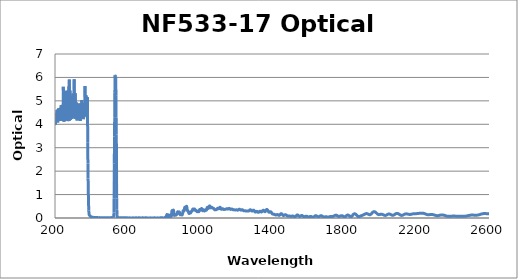
| Category | Optical Density |
|---|---|
| 2600.0 | 0.178 |
| 2599.0 | 0.178 |
| 2598.0 | 0.178 |
| 2597.0 | 0.178 |
| 2596.0 | 0.179 |
| 2595.0 | 0.179 |
| 2594.0 | 0.18 |
| 2593.0 | 0.181 |
| 2592.0 | 0.181 |
| 2591.0 | 0.182 |
| 2590.0 | 0.183 |
| 2589.0 | 0.183 |
| 2588.0 | 0.183 |
| 2587.0 | 0.184 |
| 2586.0 | 0.185 |
| 2585.0 | 0.186 |
| 2584.0 | 0.187 |
| 2583.0 | 0.188 |
| 2582.0 | 0.188 |
| 2581.0 | 0.189 |
| 2580.0 | 0.189 |
| 2579.0 | 0.189 |
| 2578.0 | 0.19 |
| 2577.0 | 0.19 |
| 2576.0 | 0.19 |
| 2575.0 | 0.19 |
| 2574.0 | 0.19 |
| 2573.0 | 0.19 |
| 2572.0 | 0.189 |
| 2571.0 | 0.189 |
| 2570.0 | 0.188 |
| 2569.0 | 0.187 |
| 2568.0 | 0.186 |
| 2567.0 | 0.184 |
| 2566.0 | 0.183 |
| 2565.0 | 0.182 |
| 2564.0 | 0.18 |
| 2563.0 | 0.179 |
| 2562.0 | 0.177 |
| 2561.0 | 0.175 |
| 2560.0 | 0.174 |
| 2559.0 | 0.172 |
| 2558.0 | 0.17 |
| 2557.0 | 0.168 |
| 2556.0 | 0.166 |
| 2555.0 | 0.164 |
| 2554.0 | 0.162 |
| 2553.0 | 0.16 |
| 2552.0 | 0.157 |
| 2551.0 | 0.155 |
| 2550.0 | 0.152 |
| 2549.0 | 0.149 |
| 2548.0 | 0.146 |
| 2547.0 | 0.143 |
| 2546.0 | 0.141 |
| 2545.0 | 0.139 |
| 2544.0 | 0.136 |
| 2543.0 | 0.134 |
| 2542.0 | 0.132 |
| 2541.0 | 0.13 |
| 2540.0 | 0.129 |
| 2539.0 | 0.128 |
| 2538.0 | 0.126 |
| 2537.0 | 0.125 |
| 2536.0 | 0.124 |
| 2535.0 | 0.122 |
| 2534.0 | 0.122 |
| 2533.0 | 0.121 |
| 2532.0 | 0.12 |
| 2531.0 | 0.119 |
| 2530.0 | 0.119 |
| 2529.0 | 0.119 |
| 2528.0 | 0.119 |
| 2527.0 | 0.118 |
| 2526.0 | 0.119 |
| 2525.0 | 0.119 |
| 2524.0 | 0.119 |
| 2523.0 | 0.119 |
| 2522.0 | 0.119 |
| 2521.0 | 0.12 |
| 2520.0 | 0.12 |
| 2519.0 | 0.121 |
| 2518.0 | 0.122 |
| 2517.0 | 0.122 |
| 2516.0 | 0.123 |
| 2515.0 | 0.123 |
| 2514.0 | 0.124 |
| 2513.0 | 0.124 |
| 2512.0 | 0.124 |
| 2511.0 | 0.125 |
| 2510.0 | 0.125 |
| 2509.0 | 0.125 |
| 2508.0 | 0.125 |
| 2507.0 | 0.125 |
| 2506.0 | 0.125 |
| 2505.0 | 0.125 |
| 2504.0 | 0.125 |
| 2503.0 | 0.124 |
| 2502.0 | 0.124 |
| 2501.0 | 0.123 |
| 2500.0 | 0.123 |
| 2499.0 | 0.122 |
| 2498.0 | 0.121 |
| 2497.0 | 0.119 |
| 2496.0 | 0.118 |
| 2495.0 | 0.117 |
| 2494.0 | 0.116 |
| 2493.0 | 0.115 |
| 2492.0 | 0.113 |
| 2491.0 | 0.112 |
| 2490.0 | 0.11 |
| 2489.0 | 0.108 |
| 2488.0 | 0.107 |
| 2487.0 | 0.105 |
| 2486.0 | 0.103 |
| 2485.0 | 0.102 |
| 2484.0 | 0.1 |
| 2483.0 | 0.098 |
| 2482.0 | 0.096 |
| 2481.0 | 0.095 |
| 2480.0 | 0.093 |
| 2479.0 | 0.091 |
| 2478.0 | 0.09 |
| 2477.0 | 0.088 |
| 2476.0 | 0.087 |
| 2475.0 | 0.085 |
| 2474.0 | 0.084 |
| 2473.0 | 0.082 |
| 2472.0 | 0.081 |
| 2471.0 | 0.08 |
| 2470.0 | 0.079 |
| 2469.0 | 0.078 |
| 2468.0 | 0.077 |
| 2467.0 | 0.076 |
| 2466.0 | 0.076 |
| 2465.0 | 0.075 |
| 2464.0 | 0.074 |
| 2463.0 | 0.074 |
| 2462.0 | 0.073 |
| 2461.0 | 0.073 |
| 2460.0 | 0.073 |
| 2459.0 | 0.073 |
| 2458.0 | 0.073 |
| 2457.0 | 0.072 |
| 2456.0 | 0.072 |
| 2455.0 | 0.072 |
| 2454.0 | 0.072 |
| 2453.0 | 0.072 |
| 2452.0 | 0.072 |
| 2451.0 | 0.073 |
| 2450.0 | 0.073 |
| 2449.0 | 0.073 |
| 2448.0 | 0.073 |
| 2447.0 | 0.073 |
| 2446.0 | 0.073 |
| 2445.0 | 0.073 |
| 2444.0 | 0.073 |
| 2443.0 | 0.073 |
| 2442.0 | 0.073 |
| 2441.0 | 0.073 |
| 2440.0 | 0.073 |
| 2439.0 | 0.074 |
| 2438.0 | 0.074 |
| 2437.0 | 0.074 |
| 2436.0 | 0.074 |
| 2435.0 | 0.074 |
| 2434.0 | 0.074 |
| 2433.0 | 0.074 |
| 2432.0 | 0.074 |
| 2431.0 | 0.074 |
| 2430.0 | 0.075 |
| 2429.0 | 0.075 |
| 2428.0 | 0.075 |
| 2427.0 | 0.075 |
| 2426.0 | 0.075 |
| 2425.0 | 0.076 |
| 2424.0 | 0.076 |
| 2423.0 | 0.076 |
| 2422.0 | 0.077 |
| 2421.0 | 0.077 |
| 2420.0 | 0.078 |
| 2419.0 | 0.078 |
| 2418.0 | 0.078 |
| 2417.0 | 0.079 |
| 2416.0 | 0.079 |
| 2415.0 | 0.079 |
| 2414.0 | 0.08 |
| 2413.0 | 0.08 |
| 2412.0 | 0.081 |
| 2411.0 | 0.081 |
| 2410.0 | 0.082 |
| 2409.0 | 0.082 |
| 2408.0 | 0.082 |
| 2407.0 | 0.082 |
| 2406.0 | 0.082 |
| 2405.0 | 0.082 |
| 2404.0 | 0.082 |
| 2403.0 | 0.082 |
| 2402.0 | 0.082 |
| 2401.0 | 0.082 |
| 2400.0 | 0.082 |
| 2399.0 | 0.082 |
| 2398.0 | 0.081 |
| 2397.0 | 0.081 |
| 2396.0 | 0.08 |
| 2395.0 | 0.08 |
| 2394.0 | 0.079 |
| 2393.0 | 0.078 |
| 2392.0 | 0.078 |
| 2391.0 | 0.077 |
| 2390.0 | 0.076 |
| 2389.0 | 0.076 |
| 2388.0 | 0.075 |
| 2387.0 | 0.074 |
| 2386.0 | 0.073 |
| 2385.0 | 0.072 |
| 2384.0 | 0.072 |
| 2383.0 | 0.071 |
| 2382.0 | 0.071 |
| 2381.0 | 0.071 |
| 2380.0 | 0.07 |
| 2379.0 | 0.07 |
| 2378.0 | 0.07 |
| 2377.0 | 0.07 |
| 2376.0 | 0.07 |
| 2375.0 | 0.071 |
| 2374.0 | 0.071 |
| 2373.0 | 0.072 |
| 2372.0 | 0.073 |
| 2371.0 | 0.074 |
| 2370.0 | 0.075 |
| 2369.0 | 0.077 |
| 2368.0 | 0.078 |
| 2367.0 | 0.08 |
| 2366.0 | 0.082 |
| 2365.0 | 0.084 |
| 2364.0 | 0.086 |
| 2363.0 | 0.088 |
| 2362.0 | 0.09 |
| 2361.0 | 0.093 |
| 2360.0 | 0.095 |
| 2359.0 | 0.098 |
| 2358.0 | 0.1 |
| 2357.0 | 0.103 |
| 2356.0 | 0.106 |
| 2355.0 | 0.108 |
| 2354.0 | 0.111 |
| 2353.0 | 0.113 |
| 2352.0 | 0.115 |
| 2351.0 | 0.118 |
| 2350.0 | 0.12 |
| 2349.0 | 0.122 |
| 2348.0 | 0.124 |
| 2347.0 | 0.125 |
| 2346.0 | 0.126 |
| 2345.0 | 0.128 |
| 2344.0 | 0.129 |
| 2343.0 | 0.129 |
| 2342.0 | 0.13 |
| 2341.0 | 0.13 |
| 2340.0 | 0.13 |
| 2339.0 | 0.13 |
| 2338.0 | 0.13 |
| 2337.0 | 0.129 |
| 2336.0 | 0.129 |
| 2335.0 | 0.128 |
| 2334.0 | 0.127 |
| 2333.0 | 0.126 |
| 2332.0 | 0.124 |
| 2331.0 | 0.122 |
| 2330.0 | 0.121 |
| 2329.0 | 0.119 |
| 2328.0 | 0.118 |
| 2327.0 | 0.116 |
| 2326.0 | 0.114 |
| 2325.0 | 0.112 |
| 2324.0 | 0.11 |
| 2323.0 | 0.108 |
| 2322.0 | 0.107 |
| 2321.0 | 0.105 |
| 2320.0 | 0.104 |
| 2319.0 | 0.103 |
| 2318.0 | 0.101 |
| 2317.0 | 0.101 |
| 2316.0 | 0.1 |
| 2315.0 | 0.099 |
| 2314.0 | 0.099 |
| 2313.0 | 0.099 |
| 2312.0 | 0.1 |
| 2311.0 | 0.1 |
| 2310.0 | 0.101 |
| 2309.0 | 0.102 |
| 2308.0 | 0.103 |
| 2307.0 | 0.105 |
| 2306.0 | 0.107 |
| 2305.0 | 0.109 |
| 2304.0 | 0.111 |
| 2303.0 | 0.113 |
| 2302.0 | 0.116 |
| 2301.0 | 0.118 |
| 2300.0 | 0.121 |
| 2299.0 | 0.124 |
| 2298.0 | 0.126 |
| 2297.0 | 0.129 |
| 2296.0 | 0.131 |
| 2295.0 | 0.134 |
| 2294.0 | 0.136 |
| 2293.0 | 0.138 |
| 2292.0 | 0.14 |
| 2291.0 | 0.142 |
| 2290.0 | 0.144 |
| 2289.0 | 0.146 |
| 2288.0 | 0.147 |
| 2287.0 | 0.148 |
| 2286.0 | 0.149 |
| 2285.0 | 0.15 |
| 2284.0 | 0.151 |
| 2283.0 | 0.151 |
| 2282.0 | 0.151 |
| 2281.0 | 0.151 |
| 2280.0 | 0.151 |
| 2279.0 | 0.15 |
| 2278.0 | 0.15 |
| 2277.0 | 0.149 |
| 2276.0 | 0.148 |
| 2275.0 | 0.147 |
| 2274.0 | 0.146 |
| 2273.0 | 0.145 |
| 2272.0 | 0.144 |
| 2271.0 | 0.143 |
| 2270.0 | 0.142 |
| 2269.0 | 0.141 |
| 2268.0 | 0.141 |
| 2267.0 | 0.14 |
| 2266.0 | 0.14 |
| 2265.0 | 0.14 |
| 2264.0 | 0.14 |
| 2263.0 | 0.14 |
| 2262.0 | 0.141 |
| 2261.0 | 0.142 |
| 2260.0 | 0.143 |
| 2259.0 | 0.144 |
| 2258.0 | 0.146 |
| 2257.0 | 0.148 |
| 2256.0 | 0.15 |
| 2255.0 | 0.152 |
| 2254.0 | 0.155 |
| 2253.0 | 0.158 |
| 2252.0 | 0.161 |
| 2251.0 | 0.164 |
| 2250.0 | 0.167 |
| 2249.0 | 0.17 |
| 2248.0 | 0.173 |
| 2247.0 | 0.176 |
| 2246.0 | 0.18 |
| 2245.0 | 0.183 |
| 2244.0 | 0.186 |
| 2243.0 | 0.189 |
| 2242.0 | 0.192 |
| 2241.0 | 0.194 |
| 2240.0 | 0.196 |
| 2239.0 | 0.198 |
| 2238.0 | 0.2 |
| 2237.0 | 0.202 |
| 2236.0 | 0.204 |
| 2235.0 | 0.205 |
| 2234.0 | 0.206 |
| 2233.0 | 0.207 |
| 2232.0 | 0.207 |
| 2231.0 | 0.207 |
| 2230.0 | 0.207 |
| 2229.0 | 0.208 |
| 2228.0 | 0.207 |
| 2227.0 | 0.207 |
| 2226.0 | 0.206 |
| 2225.0 | 0.206 |
| 2224.0 | 0.205 |
| 2223.0 | 0.205 |
| 2222.0 | 0.204 |
| 2221.0 | 0.203 |
| 2220.0 | 0.203 |
| 2219.0 | 0.202 |
| 2218.0 | 0.201 |
| 2217.0 | 0.201 |
| 2216.0 | 0.2 |
| 2215.0 | 0.199 |
| 2214.0 | 0.199 |
| 2213.0 | 0.198 |
| 2212.0 | 0.198 |
| 2211.0 | 0.197 |
| 2210.0 | 0.197 |
| 2209.0 | 0.196 |
| 2208.0 | 0.195 |
| 2207.0 | 0.194 |
| 2206.0 | 0.194 |
| 2205.0 | 0.192 |
| 2204.0 | 0.191 |
| 2203.0 | 0.19 |
| 2202.0 | 0.189 |
| 2201.0 | 0.188 |
| 2200.0 | 0.187 |
| 2199.0 | 0.186 |
| 2198.0 | 0.185 |
| 2197.0 | 0.184 |
| 2196.0 | 0.184 |
| 2195.0 | 0.184 |
| 2194.0 | 0.184 |
| 2193.0 | 0.183 |
| 2192.0 | 0.183 |
| 2191.0 | 0.183 |
| 2190.0 | 0.183 |
| 2189.0 | 0.183 |
| 2188.0 | 0.184 |
| 2187.0 | 0.183 |
| 2186.0 | 0.183 |
| 2185.0 | 0.182 |
| 2184.0 | 0.182 |
| 2183.0 | 0.181 |
| 2182.0 | 0.18 |
| 2181.0 | 0.179 |
| 2180.0 | 0.178 |
| 2179.0 | 0.177 |
| 2178.0 | 0.175 |
| 2177.0 | 0.173 |
| 2176.0 | 0.171 |
| 2175.0 | 0.17 |
| 2174.0 | 0.168 |
| 2173.0 | 0.165 |
| 2172.0 | 0.163 |
| 2171.0 | 0.162 |
| 2170.0 | 0.16 |
| 2169.0 | 0.158 |
| 2168.0 | 0.157 |
| 2167.0 | 0.155 |
| 2166.0 | 0.154 |
| 2165.0 | 0.153 |
| 2164.0 | 0.153 |
| 2163.0 | 0.152 |
| 2162.0 | 0.152 |
| 2161.0 | 0.152 |
| 2160.0 | 0.153 |
| 2159.0 | 0.153 |
| 2158.0 | 0.154 |
| 2157.0 | 0.156 |
| 2156.0 | 0.157 |
| 2155.0 | 0.159 |
| 2154.0 | 0.161 |
| 2153.0 | 0.163 |
| 2152.0 | 0.164 |
| 2151.0 | 0.166 |
| 2150.0 | 0.168 |
| 2149.0 | 0.17 |
| 2148.0 | 0.172 |
| 2147.0 | 0.173 |
| 2146.0 | 0.175 |
| 2145.0 | 0.176 |
| 2144.0 | 0.176 |
| 2143.0 | 0.177 |
| 2142.0 | 0.177 |
| 2141.0 | 0.177 |
| 2140.0 | 0.176 |
| 2139.0 | 0.175 |
| 2138.0 | 0.173 |
| 2137.0 | 0.171 |
| 2136.0 | 0.169 |
| 2135.0 | 0.167 |
| 2134.0 | 0.164 |
| 2133.0 | 0.161 |
| 2132.0 | 0.157 |
| 2131.0 | 0.153 |
| 2130.0 | 0.15 |
| 2129.0 | 0.146 |
| 2128.0 | 0.142 |
| 2127.0 | 0.138 |
| 2126.0 | 0.134 |
| 2125.0 | 0.13 |
| 2124.0 | 0.126 |
| 2123.0 | 0.122 |
| 2122.0 | 0.119 |
| 2121.0 | 0.116 |
| 2120.0 | 0.114 |
| 2119.0 | 0.112 |
| 2118.0 | 0.111 |
| 2117.0 | 0.111 |
| 2116.0 | 0.111 |
| 2115.0 | 0.112 |
| 2114.0 | 0.113 |
| 2113.0 | 0.115 |
| 2112.0 | 0.118 |
| 2111.0 | 0.122 |
| 2110.0 | 0.125 |
| 2109.0 | 0.13 |
| 2108.0 | 0.135 |
| 2107.0 | 0.14 |
| 2106.0 | 0.145 |
| 2105.0 | 0.15 |
| 2104.0 | 0.155 |
| 2103.0 | 0.161 |
| 2102.0 | 0.166 |
| 2101.0 | 0.171 |
| 2100.0 | 0.175 |
| 2099.0 | 0.179 |
| 2098.0 | 0.183 |
| 2097.0 | 0.187 |
| 2096.0 | 0.189 |
| 2095.0 | 0.192 |
| 2094.0 | 0.193 |
| 2093.0 | 0.195 |
| 2092.0 | 0.195 |
| 2091.0 | 0.195 |
| 2090.0 | 0.194 |
| 2089.0 | 0.193 |
| 2088.0 | 0.191 |
| 2087.0 | 0.189 |
| 2086.0 | 0.186 |
| 2085.0 | 0.182 |
| 2084.0 | 0.178 |
| 2083.0 | 0.174 |
| 2082.0 | 0.169 |
| 2081.0 | 0.164 |
| 2080.0 | 0.159 |
| 2079.0 | 0.154 |
| 2078.0 | 0.149 |
| 2077.0 | 0.144 |
| 2076.0 | 0.139 |
| 2075.0 | 0.134 |
| 2074.0 | 0.13 |
| 2073.0 | 0.126 |
| 2072.0 | 0.123 |
| 2071.0 | 0.121 |
| 2070.0 | 0.119 |
| 2069.0 | 0.117 |
| 2068.0 | 0.117 |
| 2067.0 | 0.117 |
| 2066.0 | 0.118 |
| 2065.0 | 0.12 |
| 2064.0 | 0.122 |
| 2063.0 | 0.125 |
| 2062.0 | 0.128 |
| 2061.0 | 0.132 |
| 2060.0 | 0.135 |
| 2059.0 | 0.139 |
| 2058.0 | 0.143 |
| 2057.0 | 0.147 |
| 2056.0 | 0.151 |
| 2055.0 | 0.155 |
| 2054.0 | 0.158 |
| 2053.0 | 0.161 |
| 2052.0 | 0.164 |
| 2051.0 | 0.167 |
| 2050.0 | 0.168 |
| 2049.0 | 0.169 |
| 2048.0 | 0.17 |
| 2047.0 | 0.171 |
| 2046.0 | 0.17 |
| 2045.0 | 0.169 |
| 2044.0 | 0.168 |
| 2043.0 | 0.165 |
| 2042.0 | 0.163 |
| 2041.0 | 0.16 |
| 2040.0 | 0.156 |
| 2039.0 | 0.152 |
| 2038.0 | 0.148 |
| 2037.0 | 0.144 |
| 2036.0 | 0.139 |
| 2035.0 | 0.135 |
| 2034.0 | 0.131 |
| 2033.0 | 0.127 |
| 2032.0 | 0.123 |
| 2031.0 | 0.119 |
| 2030.0 | 0.116 |
| 2029.0 | 0.114 |
| 2028.0 | 0.112 |
| 2027.0 | 0.111 |
| 2026.0 | 0.11 |
| 2025.0 | 0.11 |
| 2024.0 | 0.111 |
| 2023.0 | 0.113 |
| 2022.0 | 0.115 |
| 2021.0 | 0.117 |
| 2020.0 | 0.121 |
| 2019.0 | 0.124 |
| 2018.0 | 0.128 |
| 2017.0 | 0.132 |
| 2016.0 | 0.135 |
| 2015.0 | 0.139 |
| 2014.0 | 0.143 |
| 2013.0 | 0.147 |
| 2012.0 | 0.15 |
| 2011.0 | 0.153 |
| 2010.0 | 0.156 |
| 2009.0 | 0.158 |
| 2008.0 | 0.16 |
| 2007.0 | 0.161 |
| 2006.0 | 0.162 |
| 2005.0 | 0.163 |
| 2004.0 | 0.162 |
| 2003.0 | 0.162 |
| 2002.0 | 0.161 |
| 2001.0 | 0.16 |
| 2000.0 | 0.158 |
| 1999.0 | 0.156 |
| 1998.0 | 0.154 |
| 1997.0 | 0.152 |
| 1996.0 | 0.15 |
| 1995.0 | 0.147 |
| 1994.0 | 0.146 |
| 1993.0 | 0.145 |
| 1992.0 | 0.144 |
| 1991.0 | 0.144 |
| 1990.0 | 0.144 |
| 1989.0 | 0.146 |
| 1988.0 | 0.148 |
| 1987.0 | 0.151 |
| 1986.0 | 0.155 |
| 1985.0 | 0.159 |
| 1984.0 | 0.165 |
| 1983.0 | 0.171 |
| 1982.0 | 0.177 |
| 1981.0 | 0.184 |
| 1980.0 | 0.192 |
| 1979.0 | 0.199 |
| 1978.0 | 0.207 |
| 1977.0 | 0.215 |
| 1976.0 | 0.222 |
| 1975.0 | 0.229 |
| 1974.0 | 0.236 |
| 1973.0 | 0.243 |
| 1972.0 | 0.249 |
| 1971.0 | 0.255 |
| 1970.0 | 0.259 |
| 1969.0 | 0.264 |
| 1968.0 | 0.267 |
| 1967.0 | 0.269 |
| 1966.0 | 0.27 |
| 1965.0 | 0.271 |
| 1964.0 | 0.271 |
| 1963.0 | 0.269 |
| 1962.0 | 0.267 |
| 1961.0 | 0.264 |
| 1960.0 | 0.259 |
| 1959.0 | 0.254 |
| 1958.0 | 0.248 |
| 1957.0 | 0.241 |
| 1956.0 | 0.234 |
| 1955.0 | 0.226 |
| 1954.0 | 0.218 |
| 1953.0 | 0.21 |
| 1952.0 | 0.201 |
| 1951.0 | 0.193 |
| 1950.0 | 0.184 |
| 1949.0 | 0.177 |
| 1948.0 | 0.169 |
| 1947.0 | 0.162 |
| 1946.0 | 0.156 |
| 1945.0 | 0.151 |
| 1944.0 | 0.147 |
| 1943.0 | 0.144 |
| 1942.0 | 0.142 |
| 1941.0 | 0.141 |
| 1940.0 | 0.141 |
| 1939.0 | 0.142 |
| 1938.0 | 0.144 |
| 1937.0 | 0.146 |
| 1936.0 | 0.149 |
| 1935.0 | 0.152 |
| 1934.0 | 0.156 |
| 1933.0 | 0.159 |
| 1932.0 | 0.163 |
| 1931.0 | 0.167 |
| 1930.0 | 0.171 |
| 1929.0 | 0.175 |
| 1928.0 | 0.178 |
| 1927.0 | 0.181 |
| 1926.0 | 0.184 |
| 1925.0 | 0.186 |
| 1924.0 | 0.187 |
| 1923.0 | 0.187 |
| 1922.0 | 0.187 |
| 1921.0 | 0.187 |
| 1920.0 | 0.186 |
| 1919.0 | 0.184 |
| 1918.0 | 0.182 |
| 1917.0 | 0.179 |
| 1916.0 | 0.176 |
| 1915.0 | 0.172 |
| 1914.0 | 0.168 |
| 1913.0 | 0.164 |
| 1912.0 | 0.16 |
| 1911.0 | 0.155 |
| 1910.0 | 0.151 |
| 1909.0 | 0.147 |
| 1908.0 | 0.143 |
| 1907.0 | 0.139 |
| 1906.0 | 0.135 |
| 1905.0 | 0.131 |
| 1904.0 | 0.128 |
| 1903.0 | 0.125 |
| 1902.0 | 0.122 |
| 1901.0 | 0.119 |
| 1900.0 | 0.116 |
| 1899.0 | 0.113 |
| 1898.0 | 0.111 |
| 1897.0 | 0.108 |
| 1896.0 | 0.105 |
| 1895.0 | 0.103 |
| 1894.0 | 0.099 |
| 1893.0 | 0.096 |
| 1892.0 | 0.093 |
| 1891.0 | 0.09 |
| 1890.0 | 0.087 |
| 1889.0 | 0.083 |
| 1888.0 | 0.08 |
| 1887.0 | 0.076 |
| 1886.0 | 0.073 |
| 1885.0 | 0.07 |
| 1884.0 | 0.067 |
| 1883.0 | 0.064 |
| 1882.0 | 0.062 |
| 1881.0 | 0.06 |
| 1880.0 | 0.059 |
| 1879.0 | 0.059 |
| 1878.0 | 0.06 |
| 1877.0 | 0.062 |
| 1876.0 | 0.065 |
| 1875.0 | 0.069 |
| 1874.0 | 0.075 |
| 1873.0 | 0.081 |
| 1872.0 | 0.089 |
| 1871.0 | 0.096 |
| 1870.0 | 0.104 |
| 1869.0 | 0.113 |
| 1868.0 | 0.122 |
| 1867.0 | 0.13 |
| 1866.0 | 0.138 |
| 1865.0 | 0.145 |
| 1864.0 | 0.151 |
| 1863.0 | 0.157 |
| 1862.0 | 0.163 |
| 1861.0 | 0.169 |
| 1860.0 | 0.173 |
| 1859.0 | 0.177 |
| 1858.0 | 0.179 |
| 1857.0 | 0.179 |
| 1856.0 | 0.179 |
| 1855.0 | 0.177 |
| 1854.0 | 0.174 |
| 1853.0 | 0.17 |
| 1852.0 | 0.165 |
| 1851.0 | 0.16 |
| 1850.0 | 0.154 |
| 1849.0 | 0.145 |
| 1848.0 | 0.135 |
| 1847.0 | 0.125 |
| 1846.0 | 0.115 |
| 1845.0 | 0.108 |
| 1844.0 | 0.099 |
| 1843.0 | 0.09 |
| 1842.0 | 0.081 |
| 1841.0 | 0.073 |
| 1840.0 | 0.066 |
| 1839.0 | 0.061 |
| 1838.0 | 0.057 |
| 1837.0 | 0.054 |
| 1836.0 | 0.054 |
| 1835.0 | 0.054 |
| 1834.0 | 0.056 |
| 1833.0 | 0.059 |
| 1832.0 | 0.063 |
| 1831.0 | 0.069 |
| 1830.0 | 0.075 |
| 1829.0 | 0.083 |
| 1828.0 | 0.089 |
| 1827.0 | 0.096 |
| 1826.0 | 0.103 |
| 1825.0 | 0.109 |
| 1824.0 | 0.114 |
| 1823.0 | 0.117 |
| 1822.0 | 0.121 |
| 1821.0 | 0.124 |
| 1820.0 | 0.126 |
| 1819.0 | 0.127 |
| 1818.0 | 0.126 |
| 1817.0 | 0.124 |
| 1816.0 | 0.121 |
| 1815.0 | 0.117 |
| 1814.0 | 0.112 |
| 1813.0 | 0.107 |
| 1812.0 | 0.101 |
| 1811.0 | 0.094 |
| 1810.0 | 0.087 |
| 1809.0 | 0.081 |
| 1808.0 | 0.074 |
| 1807.0 | 0.069 |
| 1806.0 | 0.063 |
| 1805.0 | 0.058 |
| 1804.0 | 0.054 |
| 1803.0 | 0.051 |
| 1802.0 | 0.049 |
| 1801.0 | 0.048 |
| 1800.0 | 0.049 |
| 1799.0 | 0.051 |
| 1798.0 | 0.054 |
| 1797.0 | 0.057 |
| 1796.0 | 0.061 |
| 1795.0 | 0.066 |
| 1794.0 | 0.071 |
| 1793.0 | 0.077 |
| 1792.0 | 0.082 |
| 1791.0 | 0.087 |
| 1790.0 | 0.091 |
| 1789.0 | 0.094 |
| 1788.0 | 0.097 |
| 1787.0 | 0.099 |
| 1786.0 | 0.101 |
| 1785.0 | 0.101 |
| 1784.0 | 0.101 |
| 1783.0 | 0.099 |
| 1782.0 | 0.097 |
| 1781.0 | 0.095 |
| 1780.0 | 0.091 |
| 1779.0 | 0.088 |
| 1778.0 | 0.084 |
| 1777.0 | 0.08 |
| 1776.0 | 0.077 |
| 1775.0 | 0.073 |
| 1774.0 | 0.071 |
| 1773.0 | 0.068 |
| 1772.0 | 0.067 |
| 1771.0 | 0.066 |
| 1770.0 | 0.066 |
| 1769.0 | 0.067 |
| 1768.0 | 0.069 |
| 1767.0 | 0.071 |
| 1766.0 | 0.075 |
| 1765.0 | 0.079 |
| 1764.0 | 0.083 |
| 1763.0 | 0.088 |
| 1762.0 | 0.093 |
| 1761.0 | 0.098 |
| 1760.0 | 0.103 |
| 1759.0 | 0.108 |
| 1758.0 | 0.112 |
| 1757.0 | 0.115 |
| 1756.0 | 0.118 |
| 1755.0 | 0.12 |
| 1754.0 | 0.121 |
| 1753.0 | 0.121 |
| 1752.0 | 0.121 |
| 1751.0 | 0.119 |
| 1750.0 | 0.117 |
| 1749.0 | 0.114 |
| 1748.0 | 0.111 |
| 1747.0 | 0.107 |
| 1746.0 | 0.103 |
| 1745.0 | 0.098 |
| 1744.0 | 0.094 |
| 1743.0 | 0.089 |
| 1742.0 | 0.085 |
| 1741.0 | 0.081 |
| 1740.0 | 0.078 |
| 1739.0 | 0.075 |
| 1738.0 | 0.072 |
| 1737.0 | 0.07 |
| 1736.0 | 0.069 |
| 1735.0 | 0.068 |
| 1734.0 | 0.068 |
| 1733.0 | 0.067 |
| 1732.0 | 0.067 |
| 1731.0 | 0.068 |
| 1730.0 | 0.068 |
| 1729.0 | 0.068 |
| 1728.0 | 0.068 |
| 1727.0 | 0.068 |
| 1726.0 | 0.067 |
| 1725.0 | 0.067 |
| 1724.0 | 0.066 |
| 1723.0 | 0.064 |
| 1722.0 | 0.063 |
| 1721.0 | 0.061 |
| 1720.0 | 0.058 |
| 1719.0 | 0.056 |
| 1718.0 | 0.053 |
| 1717.0 | 0.051 |
| 1716.0 | 0.048 |
| 1715.0 | 0.046 |
| 1714.0 | 0.044 |
| 1713.0 | 0.042 |
| 1712.0 | 0.041 |
| 1711.0 | 0.041 |
| 1710.0 | 0.04 |
| 1709.0 | 0.04 |
| 1708.0 | 0.041 |
| 1707.0 | 0.042 |
| 1706.0 | 0.043 |
| 1705.0 | 0.045 |
| 1704.0 | 0.046 |
| 1703.0 | 0.048 |
| 1702.0 | 0.049 |
| 1701.0 | 0.05 |
| 1700.0 | 0.051 |
| 1699.0 | 0.051 |
| 1698.0 | 0.051 |
| 1697.0 | 0.051 |
| 1696.0 | 0.051 |
| 1695.0 | 0.05 |
| 1694.0 | 0.049 |
| 1693.0 | 0.048 |
| 1692.0 | 0.047 |
| 1691.0 | 0.046 |
| 1690.0 | 0.045 |
| 1689.0 | 0.045 |
| 1688.0 | 0.045 |
| 1687.0 | 0.045 |
| 1686.0 | 0.046 |
| 1685.0 | 0.048 |
| 1684.0 | 0.051 |
| 1683.0 | 0.054 |
| 1682.0 | 0.058 |
| 1681.0 | 0.063 |
| 1680.0 | 0.068 |
| 1679.0 | 0.073 |
| 1678.0 | 0.078 |
| 1677.0 | 0.083 |
| 1676.0 | 0.087 |
| 1675.0 | 0.092 |
| 1674.0 | 0.095 |
| 1673.0 | 0.098 |
| 1672.0 | 0.099 |
| 1671.0 | 0.1 |
| 1670.0 | 0.099 |
| 1669.0 | 0.098 |
| 1668.0 | 0.095 |
| 1667.0 | 0.092 |
| 1666.0 | 0.087 |
| 1665.0 | 0.083 |
| 1664.0 | 0.077 |
| 1663.0 | 0.072 |
| 1662.0 | 0.067 |
| 1661.0 | 0.062 |
| 1660.0 | 0.057 |
| 1659.0 | 0.054 |
| 1658.0 | 0.051 |
| 1657.0 | 0.05 |
| 1656.0 | 0.049 |
| 1655.0 | 0.05 |
| 1654.0 | 0.052 |
| 1653.0 | 0.055 |
| 1652.0 | 0.059 |
| 1651.0 | 0.064 |
| 1650.0 | 0.069 |
| 1649.0 | 0.075 |
| 1648.0 | 0.08 |
| 1647.0 | 0.085 |
| 1646.0 | 0.09 |
| 1645.0 | 0.094 |
| 1644.0 | 0.096 |
| 1643.0 | 0.098 |
| 1642.0 | 0.099 |
| 1641.0 | 0.098 |
| 1640.0 | 0.096 |
| 1639.0 | 0.093 |
| 1638.0 | 0.088 |
| 1637.0 | 0.083 |
| 1636.0 | 0.077 |
| 1635.0 | 0.07 |
| 1634.0 | 0.062 |
| 1633.0 | 0.055 |
| 1632.0 | 0.048 |
| 1631.0 | 0.042 |
| 1630.0 | 0.037 |
| 1629.0 | 0.033 |
| 1628.0 | 0.031 |
| 1627.0 | 0.029 |
| 1626.0 | 0.03 |
| 1625.0 | 0.031 |
| 1624.0 | 0.034 |
| 1623.0 | 0.037 |
| 1622.0 | 0.042 |
| 1621.0 | 0.046 |
| 1620.0 | 0.051 |
| 1619.0 | 0.055 |
| 1618.0 | 0.059 |
| 1617.0 | 0.063 |
| 1616.0 | 0.065 |
| 1615.0 | 0.067 |
| 1614.0 | 0.068 |
| 1613.0 | 0.068 |
| 1612.0 | 0.067 |
| 1611.0 | 0.065 |
| 1610.0 | 0.062 |
| 1609.0 | 0.059 |
| 1608.0 | 0.056 |
| 1607.0 | 0.053 |
| 1606.0 | 0.05 |
| 1605.0 | 0.047 |
| 1604.0 | 0.045 |
| 1603.0 | 0.044 |
| 1602.0 | 0.044 |
| 1601.0 | 0.044 |
| 1600.0 | 0.046 |
| 1599.0 | 0.049 |
| 1598.0 | 0.052 |
| 1597.0 | 0.056 |
| 1596.0 | 0.06 |
| 1595.0 | 0.064 |
| 1594.0 | 0.068 |
| 1593.0 | 0.072 |
| 1592.0 | 0.075 |
| 1591.0 | 0.077 |
| 1590.0 | 0.078 |
| 1589.0 | 0.078 |
| 1588.0 | 0.077 |
| 1587.0 | 0.075 |
| 1586.0 | 0.072 |
| 1585.0 | 0.069 |
| 1584.0 | 0.066 |
| 1583.0 | 0.062 |
| 1582.0 | 0.059 |
| 1581.0 | 0.056 |
| 1580.0 | 0.055 |
| 1579.0 | 0.054 |
| 1578.0 | 0.054 |
| 1577.0 | 0.056 |
| 1576.0 | 0.058 |
| 1575.0 | 0.062 |
| 1574.0 | 0.067 |
| 1573.0 | 0.072 |
| 1572.0 | 0.078 |
| 1571.0 | 0.083 |
| 1570.0 | 0.089 |
| 1569.0 | 0.094 |
| 1568.0 | 0.098 |
| 1567.0 | 0.102 |
| 1566.0 | 0.104 |
| 1565.0 | 0.105 |
| 1564.0 | 0.105 |
| 1563.0 | 0.103 |
| 1562.0 | 0.101 |
| 1561.0 | 0.097 |
| 1560.0 | 0.092 |
| 1559.0 | 0.087 |
| 1558.0 | 0.082 |
| 1557.0 | 0.077 |
| 1556.0 | 0.073 |
| 1555.0 | 0.07 |
| 1554.0 | 0.068 |
| 1553.0 | 0.068 |
| 1552.0 | 0.069 |
| 1551.0 | 0.073 |
| 1550.0 | 0.077 |
| 1549.0 | 0.083 |
| 1548.0 | 0.09 |
| 1547.0 | 0.097 |
| 1546.0 | 0.105 |
| 1545.0 | 0.112 |
| 1544.0 | 0.118 |
| 1543.0 | 0.123 |
| 1542.0 | 0.127 |
| 1541.0 | 0.129 |
| 1540.0 | 0.129 |
| 1539.0 | 0.128 |
| 1538.0 | 0.125 |
| 1537.0 | 0.121 |
| 1536.0 | 0.115 |
| 1535.0 | 0.108 |
| 1534.0 | 0.1 |
| 1533.0 | 0.092 |
| 1532.0 | 0.083 |
| 1531.0 | 0.075 |
| 1530.0 | 0.068 |
| 1529.0 | 0.062 |
| 1528.0 | 0.057 |
| 1527.0 | 0.054 |
| 1526.0 | 0.053 |
| 1525.0 | 0.053 |
| 1524.0 | 0.055 |
| 1523.0 | 0.058 |
| 1522.0 | 0.062 |
| 1521.0 | 0.066 |
| 1520.0 | 0.071 |
| 1519.0 | 0.076 |
| 1518.0 | 0.079 |
| 1517.0 | 0.082 |
| 1516.0 | 0.085 |
| 1515.0 | 0.086 |
| 1514.0 | 0.085 |
| 1513.0 | 0.084 |
| 1512.0 | 0.082 |
| 1511.0 | 0.08 |
| 1510.0 | 0.077 |
| 1509.0 | 0.074 |
| 1508.0 | 0.072 |
| 1507.0 | 0.069 |
| 1506.0 | 0.068 |
| 1505.0 | 0.068 |
| 1504.0 | 0.069 |
| 1503.0 | 0.07 |
| 1502.0 | 0.072 |
| 1501.0 | 0.075 |
| 1500.0 | 0.078 |
| 1499.0 | 0.081 |
| 1498.0 | 0.084 |
| 1497.0 | 0.086 |
| 1496.0 | 0.088 |
| 1495.0 | 0.09 |
| 1494.0 | 0.09 |
| 1493.0 | 0.091 |
| 1492.0 | 0.09 |
| 1491.0 | 0.09 |
| 1490.0 | 0.089 |
| 1489.0 | 0.088 |
| 1488.0 | 0.088 |
| 1487.0 | 0.088 |
| 1486.0 | 0.089 |
| 1485.0 | 0.092 |
| 1484.0 | 0.095 |
| 1483.0 | 0.099 |
| 1482.0 | 0.104 |
| 1481.0 | 0.11 |
| 1480.0 | 0.116 |
| 1479.0 | 0.123 |
| 1478.0 | 0.128 |
| 1477.0 | 0.134 |
| 1476.0 | 0.138 |
| 1475.0 | 0.14 |
| 1474.0 | 0.141 |
| 1473.0 | 0.14 |
| 1472.0 | 0.138 |
| 1471.0 | 0.135 |
| 1470.0 | 0.13 |
| 1469.0 | 0.125 |
| 1468.0 | 0.119 |
| 1467.0 | 0.114 |
| 1466.0 | 0.11 |
| 1465.0 | 0.107 |
| 1464.0 | 0.107 |
| 1463.0 | 0.108 |
| 1462.0 | 0.111 |
| 1461.0 | 0.116 |
| 1460.0 | 0.124 |
| 1459.0 | 0.132 |
| 1458.0 | 0.142 |
| 1457.0 | 0.151 |
| 1456.0 | 0.16 |
| 1455.0 | 0.168 |
| 1454.0 | 0.175 |
| 1453.0 | 0.18 |
| 1452.0 | 0.183 |
| 1451.0 | 0.184 |
| 1450.0 | 0.183 |
| 1449.0 | 0.179 |
| 1448.0 | 0.174 |
| 1447.0 | 0.166 |
| 1446.0 | 0.157 |
| 1445.0 | 0.148 |
| 1444.0 | 0.139 |
| 1443.0 | 0.131 |
| 1442.0 | 0.123 |
| 1441.0 | 0.117 |
| 1440.0 | 0.113 |
| 1439.0 | 0.112 |
| 1438.0 | 0.112 |
| 1437.0 | 0.115 |
| 1436.0 | 0.12 |
| 1435.0 | 0.125 |
| 1434.0 | 0.13 |
| 1433.0 | 0.136 |
| 1432.0 | 0.14 |
| 1431.0 | 0.144 |
| 1430.0 | 0.146 |
| 1429.0 | 0.147 |
| 1428.0 | 0.146 |
| 1427.0 | 0.144 |
| 1426.0 | 0.141 |
| 1425.0 | 0.138 |
| 1424.0 | 0.135 |
| 1423.0 | 0.132 |
| 1422.0 | 0.13 |
| 1421.0 | 0.129 |
| 1420.0 | 0.13 |
| 1419.0 | 0.132 |
| 1418.0 | 0.135 |
| 1417.0 | 0.139 |
| 1416.0 | 0.143 |
| 1415.0 | 0.148 |
| 1414.0 | 0.153 |
| 1413.0 | 0.157 |
| 1412.0 | 0.161 |
| 1411.0 | 0.163 |
| 1410.0 | 0.164 |
| 1409.0 | 0.164 |
| 1408.0 | 0.165 |
| 1407.0 | 0.165 |
| 1406.0 | 0.165 |
| 1405.0 | 0.166 |
| 1404.0 | 0.169 |
| 1403.0 | 0.173 |
| 1402.0 | 0.178 |
| 1401.0 | 0.186 |
| 1400.0 | 0.197 |
| 1399.0 | 0.209 |
| 1398.0 | 0.22 |
| 1397.0 | 0.23 |
| 1396.0 | 0.241 |
| 1395.0 | 0.253 |
| 1394.0 | 0.262 |
| 1393.0 | 0.267 |
| 1392.0 | 0.27 |
| 1391.0 | 0.27 |
| 1390.0 | 0.268 |
| 1389.0 | 0.264 |
| 1388.0 | 0.259 |
| 1387.0 | 0.254 |
| 1386.0 | 0.251 |
| 1385.0 | 0.248 |
| 1384.0 | 0.247 |
| 1383.0 | 0.25 |
| 1382.0 | 0.257 |
| 1381.0 | 0.269 |
| 1380.0 | 0.281 |
| 1379.0 | 0.293 |
| 1378.0 | 0.307 |
| 1377.0 | 0.321 |
| 1376.0 | 0.334 |
| 1375.0 | 0.345 |
| 1374.0 | 0.355 |
| 1373.0 | 0.361 |
| 1372.0 | 0.364 |
| 1371.0 | 0.364 |
| 1370.0 | 0.361 |
| 1369.0 | 0.354 |
| 1368.0 | 0.343 |
| 1367.0 | 0.331 |
| 1366.0 | 0.318 |
| 1365.0 | 0.303 |
| 1364.0 | 0.29 |
| 1363.0 | 0.28 |
| 1362.0 | 0.272 |
| 1361.0 | 0.269 |
| 1360.0 | 0.271 |
| 1359.0 | 0.276 |
| 1358.0 | 0.283 |
| 1357.0 | 0.291 |
| 1356.0 | 0.301 |
| 1355.0 | 0.311 |
| 1354.0 | 0.321 |
| 1353.0 | 0.328 |
| 1352.0 | 0.33 |
| 1351.0 | 0.329 |
| 1350.0 | 0.324 |
| 1349.0 | 0.317 |
| 1348.0 | 0.309 |
| 1347.0 | 0.298 |
| 1346.0 | 0.286 |
| 1345.0 | 0.275 |
| 1344.0 | 0.267 |
| 1343.0 | 0.261 |
| 1342.0 | 0.258 |
| 1341.0 | 0.257 |
| 1340.0 | 0.26 |
| 1339.0 | 0.265 |
| 1338.0 | 0.271 |
| 1337.0 | 0.277 |
| 1336.0 | 0.283 |
| 1335.0 | 0.287 |
| 1334.0 | 0.29 |
| 1333.0 | 0.29 |
| 1332.0 | 0.287 |
| 1331.0 | 0.282 |
| 1330.0 | 0.275 |
| 1329.0 | 0.267 |
| 1328.0 | 0.259 |
| 1327.0 | 0.251 |
| 1326.0 | 0.245 |
| 1325.0 | 0.242 |
| 1324.0 | 0.241 |
| 1323.0 | 0.243 |
| 1322.0 | 0.248 |
| 1321.0 | 0.255 |
| 1320.0 | 0.263 |
| 1319.0 | 0.271 |
| 1318.0 | 0.277 |
| 1317.0 | 0.282 |
| 1316.0 | 0.284 |
| 1315.0 | 0.284 |
| 1314.0 | 0.281 |
| 1313.0 | 0.276 |
| 1312.0 | 0.269 |
| 1311.0 | 0.263 |
| 1310.0 | 0.257 |
| 1309.0 | 0.254 |
| 1308.0 | 0.254 |
| 1307.0 | 0.257 |
| 1306.0 | 0.263 |
| 1305.0 | 0.273 |
| 1304.0 | 0.284 |
| 1303.0 | 0.296 |
| 1302.0 | 0.308 |
| 1301.0 | 0.319 |
| 1300.0 | 0.327 |
| 1299.0 | 0.333 |
| 1298.0 | 0.335 |
| 1297.0 | 0.334 |
| 1296.0 | 0.331 |
| 1295.0 | 0.325 |
| 1294.0 | 0.317 |
| 1293.0 | 0.31 |
| 1292.0 | 0.303 |
| 1291.0 | 0.297 |
| 1290.0 | 0.295 |
| 1289.0 | 0.295 |
| 1288.0 | 0.298 |
| 1287.0 | 0.304 |
| 1286.0 | 0.313 |
| 1285.0 | 0.323 |
| 1284.0 | 0.333 |
| 1283.0 | 0.341 |
| 1282.0 | 0.348 |
| 1281.0 | 0.352 |
| 1280.0 | 0.353 |
| 1279.0 | 0.351 |
| 1278.0 | 0.346 |
| 1277.0 | 0.339 |
| 1276.0 | 0.331 |
| 1275.0 | 0.322 |
| 1274.0 | 0.314 |
| 1273.0 | 0.306 |
| 1272.0 | 0.301 |
| 1271.0 | 0.297 |
| 1270.0 | 0.295 |
| 1269.0 | 0.295 |
| 1268.0 | 0.296 |
| 1267.0 | 0.298 |
| 1266.0 | 0.299 |
| 1265.0 | 0.3 |
| 1264.0 | 0.3 |
| 1263.0 | 0.3 |
| 1262.0 | 0.299 |
| 1261.0 | 0.298 |
| 1260.0 | 0.296 |
| 1259.0 | 0.296 |
| 1258.0 | 0.296 |
| 1257.0 | 0.297 |
| 1256.0 | 0.299 |
| 1255.0 | 0.301 |
| 1254.0 | 0.304 |
| 1253.0 | 0.307 |
| 1252.0 | 0.309 |
| 1251.0 | 0.311 |
| 1250.0 | 0.312 |
| 1249.0 | 0.312 |
| 1248.0 | 0.311 |
| 1247.0 | 0.31 |
| 1246.0 | 0.308 |
| 1245.0 | 0.308 |
| 1244.0 | 0.309 |
| 1243.0 | 0.312 |
| 1242.0 | 0.316 |
| 1241.0 | 0.322 |
| 1240.0 | 0.329 |
| 1239.0 | 0.337 |
| 1238.0 | 0.344 |
| 1237.0 | 0.349 |
| 1236.0 | 0.354 |
| 1235.0 | 0.355 |
| 1234.0 | 0.355 |
| 1233.0 | 0.352 |
| 1232.0 | 0.348 |
| 1231.0 | 0.344 |
| 1230.0 | 0.339 |
| 1229.0 | 0.336 |
| 1228.0 | 0.335 |
| 1227.0 | 0.337 |
| 1226.0 | 0.341 |
| 1225.0 | 0.346 |
| 1224.0 | 0.354 |
| 1223.0 | 0.361 |
| 1222.0 | 0.367 |
| 1221.0 | 0.373 |
| 1220.0 | 0.376 |
| 1219.0 | 0.376 |
| 1218.0 | 0.374 |
| 1217.0 | 0.37 |
| 1216.0 | 0.364 |
| 1215.0 | 0.357 |
| 1214.0 | 0.349 |
| 1213.0 | 0.343 |
| 1212.0 | 0.338 |
| 1211.0 | 0.335 |
| 1210.0 | 0.334 |
| 1209.0 | 0.335 |
| 1208.0 | 0.337 |
| 1207.0 | 0.341 |
| 1206.0 | 0.344 |
| 1205.0 | 0.347 |
| 1204.0 | 0.348 |
| 1203.0 | 0.349 |
| 1202.0 | 0.349 |
| 1201.0 | 0.348 |
| 1200.0 | 0.346 |
| 1199.0 | 0.345 |
| 1198.0 | 0.344 |
| 1197.0 | 0.344 |
| 1196.0 | 0.344 |
| 1195.0 | 0.345 |
| 1194.0 | 0.346 |
| 1193.0 | 0.347 |
| 1192.0 | 0.348 |
| 1191.0 | 0.348 |
| 1190.0 | 0.348 |
| 1189.0 | 0.347 |
| 1188.0 | 0.347 |
| 1187.0 | 0.348 |
| 1186.0 | 0.349 |
| 1185.0 | 0.352 |
| 1184.0 | 0.357 |
| 1183.0 | 0.362 |
| 1182.0 | 0.368 |
| 1181.0 | 0.373 |
| 1180.0 | 0.378 |
| 1179.0 | 0.381 |
| 1178.0 | 0.382 |
| 1177.0 | 0.381 |
| 1176.0 | 0.378 |
| 1175.0 | 0.375 |
| 1174.0 | 0.371 |
| 1173.0 | 0.368 |
| 1172.0 | 0.367 |
| 1171.0 | 0.369 |
| 1170.0 | 0.372 |
| 1169.0 | 0.378 |
| 1168.0 | 0.385 |
| 1167.0 | 0.393 |
| 1166.0 | 0.401 |
| 1165.0 | 0.407 |
| 1164.0 | 0.41 |
| 1163.0 | 0.411 |
| 1162.0 | 0.408 |
| 1161.0 | 0.404 |
| 1160.0 | 0.398 |
| 1159.0 | 0.392 |
| 1158.0 | 0.387 |
| 1157.0 | 0.383 |
| 1156.0 | 0.382 |
| 1155.0 | 0.383 |
| 1154.0 | 0.386 |
| 1153.0 | 0.39 |
| 1152.0 | 0.393 |
| 1151.0 | 0.395 |
| 1150.0 | 0.395 |
| 1149.0 | 0.394 |
| 1148.0 | 0.39 |
| 1147.0 | 0.386 |
| 1146.0 | 0.382 |
| 1145.0 | 0.378 |
| 1144.0 | 0.375 |
| 1143.0 | 0.373 |
| 1142.0 | 0.371 |
| 1141.0 | 0.37 |
| 1140.0 | 0.37 |
| 1139.0 | 0.369 |
| 1138.0 | 0.368 |
| 1137.0 | 0.365 |
| 1136.0 | 0.363 |
| 1135.0 | 0.362 |
| 1134.0 | 0.363 |
| 1133.0 | 0.365 |
| 1132.0 | 0.369 |
| 1131.0 | 0.374 |
| 1130.0 | 0.381 |
| 1129.0 | 0.388 |
| 1128.0 | 0.394 |
| 1127.0 | 0.398 |
| 1126.0 | 0.398 |
| 1125.0 | 0.395 |
| 1124.0 | 0.389 |
| 1123.0 | 0.381 |
| 1122.0 | 0.374 |
| 1121.0 | 0.37 |
| 1120.0 | 0.37 |
| 1119.0 | 0.377 |
| 1118.0 | 0.388 |
| 1117.0 | 0.404 |
| 1116.0 | 0.422 |
| 1115.0 | 0.438 |
| 1114.0 | 0.45 |
| 1113.0 | 0.456 |
| 1112.0 | 0.456 |
| 1111.0 | 0.451 |
| 1110.0 | 0.44 |
| 1109.0 | 0.427 |
| 1108.0 | 0.413 |
| 1107.0 | 0.402 |
| 1106.0 | 0.397 |
| 1105.0 | 0.395 |
| 1104.0 | 0.399 |
| 1103.0 | 0.405 |
| 1102.0 | 0.411 |
| 1101.0 | 0.416 |
| 1100.0 | 0.417 |
| 1099.0 | 0.414 |
| 1098.0 | 0.407 |
| 1097.0 | 0.397 |
| 1096.0 | 0.386 |
| 1095.0 | 0.375 |
| 1094.0 | 0.366 |
| 1093.0 | 0.359 |
| 1092.0 | 0.356 |
| 1091.0 | 0.356 |
| 1090.0 | 0.357 |
| 1089.0 | 0.358 |
| 1088.0 | 0.357 |
| 1087.0 | 0.355 |
| 1086.0 | 0.353 |
| 1085.0 | 0.35 |
| 1084.0 | 0.35 |
| 1083.0 | 0.353 |
| 1082.0 | 0.359 |
| 1081.0 | 0.369 |
| 1080.0 | 0.381 |
| 1079.0 | 0.393 |
| 1078.0 | 0.404 |
| 1077.0 | 0.412 |
| 1076.0 | 0.417 |
| 1075.0 | 0.419 |
| 1074.0 | 0.42 |
| 1073.0 | 0.421 |
| 1072.0 | 0.424 |
| 1071.0 | 0.43 |
| 1070.0 | 0.438 |
| 1069.0 | 0.446 |
| 1068.0 | 0.453 |
| 1067.0 | 0.456 |
| 1066.0 | 0.455 |
| 1065.0 | 0.45 |
| 1064.0 | 0.443 |
| 1063.0 | 0.436 |
| 1062.0 | 0.434 |
| 1061.0 | 0.437 |
| 1060.0 | 0.448 |
| 1059.0 | 0.465 |
| 1058.0 | 0.483 |
| 1057.0 | 0.501 |
| 1056.0 | 0.513 |
| 1055.0 | 0.518 |
| 1054.0 | 0.513 |
| 1053.0 | 0.499 |
| 1052.0 | 0.477 |
| 1051.0 | 0.452 |
| 1050.0 | 0.428 |
| 1049.0 | 0.413 |
| 1048.0 | 0.407 |
| 1047.0 | 0.412 |
| 1046.0 | 0.424 |
| 1045.0 | 0.44 |
| 1044.0 | 0.452 |
| 1043.0 | 0.456 |
| 1042.0 | 0.45 |
| 1041.0 | 0.432 |
| 1040.0 | 0.406 |
| 1039.0 | 0.376 |
| 1038.0 | 0.351 |
| 1037.0 | 0.334 |
| 1036.0 | 0.328 |
| 1035.0 | 0.332 |
| 1034.0 | 0.341 |
| 1033.0 | 0.349 |
| 1032.0 | 0.352 |
| 1031.0 | 0.347 |
| 1030.0 | 0.335 |
| 1029.0 | 0.32 |
| 1028.0 | 0.307 |
| 1027.0 | 0.301 |
| 1026.0 | 0.303 |
| 1025.0 | 0.314 |
| 1024.0 | 0.328 |
| 1023.0 | 0.342 |
| 1022.0 | 0.348 |
| 1021.0 | 0.347 |
| 1020.0 | 0.338 |
| 1019.0 | 0.325 |
| 1018.0 | 0.313 |
| 1017.0 | 0.309 |
| 1016.0 | 0.315 |
| 1015.0 | 0.331 |
| 1014.0 | 0.354 |
| 1013.0 | 0.377 |
| 1012.0 | 0.396 |
| 1011.0 | 0.405 |
| 1010.0 | 0.402 |
| 1009.0 | 0.39 |
| 1008.0 | 0.371 |
| 1007.0 | 0.352 |
| 1006.0 | 0.339 |
| 1005.0 | 0.335 |
| 1004.0 | 0.34 |
| 1003.0 | 0.352 |
| 1002.0 | 0.362 |
| 1001.0 | 0.367 |
| 1000.0 | 0.361 |
| 999.0 | 0.344 |
| 998.0 | 0.321 |
| 997.0 | 0.297 |
| 996.0 | 0.279 |
| 995.0 | 0.27 |
| 994.0 | 0.271 |
| 993.0 | 0.278 |
| 992.0 | 0.287 |
| 991.0 | 0.291 |
| 990.0 | 0.289 |
| 989.0 | 0.282 |
| 988.0 | 0.273 |
| 987.0 | 0.267 |
| 986.0 | 0.27 |
| 985.0 | 0.279 |
| 984.0 | 0.292 |
| 983.0 | 0.307 |
| 982.0 | 0.317 |
| 981.0 | 0.32 |
| 980.0 | 0.317 |
| 979.0 | 0.313 |
| 978.0 | 0.311 |
| 977.0 | 0.315 |
| 976.0 | 0.327 |
| 975.0 | 0.345 |
| 974.0 | 0.364 |
| 973.0 | 0.378 |
| 972.0 | 0.384 |
| 971.0 | 0.382 |
| 970.0 | 0.372 |
| 969.0 | 0.361 |
| 968.0 | 0.352 |
| 967.0 | 0.351 |
| 966.0 | 0.359 |
| 965.0 | 0.37 |
| 964.0 | 0.382 |
| 963.0 | 0.387 |
| 962.0 | 0.382 |
| 961.0 | 0.366 |
| 960.0 | 0.343 |
| 959.0 | 0.321 |
| 958.0 | 0.303 |
| 957.0 | 0.292 |
| 956.0 | 0.289 |
| 955.0 | 0.286 |
| 954.0 | 0.28 |
| 953.0 | 0.268 |
| 952.0 | 0.25 |
| 951.0 | 0.23 |
| 950.0 | 0.217 |
| 949.0 | 0.213 |
| 948.0 | 0.218 |
| 947.0 | 0.226 |
| 946.0 | 0.232 |
| 945.0 | 0.228 |
| 944.0 | 0.217 |
| 943.0 | 0.203 |
| 942.0 | 0.194 |
| 941.0 | 0.197 |
| 940.0 | 0.213 |
| 939.0 | 0.239 |
| 938.0 | 0.265 |
| 937.0 | 0.286 |
| 936.0 | 0.295 |
| 935.0 | 0.295 |
| 934.0 | 0.295 |
| 933.0 | 0.304 |
| 932.0 | 0.328 |
| 931.0 | 0.366 |
| 930.0 | 0.415 |
| 929.0 | 0.46 |
| 928.0 | 0.492 |
| 927.0 | 0.499 |
| 926.0 | 0.479 |
| 925.0 | 0.442 |
| 924.0 | 0.403 |
| 923.0 | 0.38 |
| 922.0 | 0.377 |
| 921.0 | 0.394 |
| 920.0 | 0.424 |
| 919.0 | 0.452 |
| 918.0 | 0.459 |
| 917.0 | 0.44 |
| 916.0 | 0.402 |
| 915.0 | 0.356 |
| 914.0 | 0.316 |
| 913.0 | 0.296 |
| 912.0 | 0.294 |
| 911.0 | 0.303 |
| 910.0 | 0.312 |
| 909.0 | 0.308 |
| 908.0 | 0.287 |
| 907.0 | 0.25 |
| 906.0 | 0.208 |
| 905.0 | 0.171 |
| 904.0 | 0.146 |
| 903.0 | 0.133 |
| 902.0 | 0.131 |
| 901.0 | 0.137 |
| 900.0 | 0.147 |
| 899.0 | 0.157 |
| 898.0 | 0.163 |
| 897.0 | 0.164 |
| 896.0 | 0.157 |
| 895.0 | 0.147 |
| 894.0 | 0.137 |
| 893.0 | 0.133 |
| 892.0 | 0.14 |
| 891.0 | 0.158 |
| 890.0 | 0.187 |
| 889.0 | 0.22 |
| 888.0 | 0.248 |
| 887.0 | 0.26 |
| 886.0 | 0.256 |
| 885.0 | 0.241 |
| 884.0 | 0.225 |
| 883.0 | 0.218 |
| 882.0 | 0.224 |
| 881.0 | 0.241 |
| 880.0 | 0.261 |
| 879.0 | 0.271 |
| 878.0 | 0.265 |
| 877.0 | 0.245 |
| 876.0 | 0.216 |
| 875.0 | 0.188 |
| 874.0 | 0.166 |
| 873.0 | 0.152 |
| 872.0 | 0.142 |
| 871.0 | 0.135 |
| 870.0 | 0.128 |
| 869.0 | 0.124 |
| 868.0 | 0.121 |
| 867.0 | 0.121 |
| 866.0 | 0.124 |
| 865.0 | 0.13 |
| 864.0 | 0.136 |
| 863.0 | 0.143 |
| 862.0 | 0.151 |
| 861.0 | 0.162 |
| 860.0 | 0.131 |
| 859.0 | 0.11 |
| 858.0 | 0.152 |
| 857.0 | 0.227 |
| 856.0 | 0.3 |
| 855.0 | 0.336 |
| 854.0 | 0.322 |
| 853.0 | 0.275 |
| 852.0 | 0.225 |
| 851.0 | 0.202 |
| 850.0 | 0.22 |
| 849.0 | 0.266 |
| 848.0 | 0.308 |
| 847.0 | 0.314 |
| 846.0 | 0.27 |
| 845.0 | 0.192 |
| 844.0 | 0.113 |
| 843.0 | 0.068 |
| 842.0 | 0.066 |
| 841.0 | 0.096 |
| 840.0 | 0.127 |
| 839.0 | 0.136 |
| 838.0 | 0.116 |
| 837.0 | 0.082 |
| 836.0 | 0.053 |
| 835.0 | 0.039 |
| 834.0 | 0.035 |
| 833.0 | 0.03 |
| 832.0 | 0.022 |
| 831.0 | 0.017 |
| 830.0 | 0.028 |
| 829.0 | 0.059 |
| 828.0 | 0.099 |
| 827.0 | 0.129 |
| 826.0 | 0.132 |
| 825.0 | 0.108 |
| 824.0 | 0.075 |
| 823.0 | 0.056 |
| 822.0 | 0.065 |
| 821.0 | 0.096 |
| 820.0 | 0.131 |
| 819.0 | 0.148 |
| 818.0 | 0.137 |
| 817.0 | 0.103 |
| 816.0 | 0.064 |
| 815.0 | 0.038 |
| 814.0 | 0.031 |
| 813.0 | 0.036 |
| 812.0 | 0.041 |
| 811.0 | 0.039 |
| 810.0 | 0.03 |
| 809.0 | 0.018 |
| 808.0 | 0.011 |
| 807.0 | 0.009 |
| 806.0 | 0.009 |
| 805.0 | 0.008 |
| 804.0 | 0.006 |
| 803.0 | 0.004 |
| 802.0 | 0.004 |
| 801.0 | 0.004 |
| 800.0 | 0.004 |
| 799.0 | 0.003 |
| 798.0 | 0.003 |
| 797.0 | 0.004 |
| 796.0 | 0.006 |
| 795.0 | 0.007 |
| 794.0 | 0.007 |
| 793.0 | 0.004 |
| 792.0 | 0.003 |
| 791.0 | 0.003 |
| 790.0 | 0.006 |
| 789.0 | 0.009 |
| 788.0 | 0.008 |
| 787.0 | 0.006 |
| 786.0 | 0.004 |
| 785.0 | 0.004 |
| 784.0 | 0.007 |
| 783.0 | 0.009 |
| 782.0 | 0.009 |
| 781.0 | 0.007 |
| 780.0 | 0.004 |
| 779.0 | 0.003 |
| 778.0 | 0.004 |
| 777.0 | 0.005 |
| 776.0 | 0.004 |
| 775.0 | 0.003 |
| 774.0 | 0.003 |
| 773.0 | 0.004 |
| 772.0 | 0.005 |
| 771.0 | 0.005 |
| 770.0 | 0.004 |
| 769.0 | 0.003 |
| 768.0 | 0.003 |
| 767.0 | 0.004 |
| 766.0 | 0.006 |
| 765.0 | 0.005 |
| 764.0 | 0.004 |
| 763.0 | 0.003 |
| 762.0 | 0.003 |
| 761.0 | 0.004 |
| 760.0 | 0.005 |
| 759.0 | 0.004 |
| 758.0 | 0.003 |
| 757.0 | 0.002 |
| 756.0 | 0.003 |
| 755.0 | 0.003 |
| 754.0 | 0.003 |
| 753.0 | 0.003 |
| 752.0 | 0.004 |
| 751.0 | 0.006 |
| 750.0 | 0.008 |
| 749.0 | 0.008 |
| 748.0 | 0.006 |
| 747.0 | 0.004 |
| 746.0 | 0.003 |
| 745.0 | 0.004 |
| 744.0 | 0.005 |
| 743.0 | 0.004 |
| 742.0 | 0.004 |
| 741.0 | 0.003 |
| 740.0 | 0.003 |
| 739.0 | 0.004 |
| 738.0 | 0.003 |
| 737.0 | 0.002 |
| 736.0 | 0.002 |
| 735.0 | 0.002 |
| 734.0 | 0.002 |
| 733.0 | 0.002 |
| 732.0 | 0.002 |
| 731.0 | 0.003 |
| 730.0 | 0.005 |
| 729.0 | 0.006 |
| 728.0 | 0.005 |
| 727.0 | 0.003 |
| 726.0 | 0.002 |
| 725.0 | 0.003 |
| 724.0 | 0.003 |
| 723.0 | 0.002 |
| 722.0 | 0.002 |
| 721.0 | 0.003 |
| 720.0 | 0.004 |
| 719.0 | 0.004 |
| 718.0 | 0.004 |
| 717.0 | 0.002 |
| 716.0 | 0.003 |
| 715.0 | 0.004 |
| 714.0 | 0.005 |
| 713.0 | 0.003 |
| 712.0 | 0.003 |
| 711.0 | 0.002 |
| 710.0 | 0.004 |
| 709.0 | 0.003 |
| 708.0 | 0.001 |
| 707.0 | 0.002 |
| 706.0 | 0.006 |
| 705.0 | 0.007 |
| 704.0 | 0.008 |
| 703.0 | 0.004 |
| 702.0 | 0.002 |
| 701.0 | 0.003 |
| 700.0 | 0.007 |
| 699.0 | 0.005 |
| 698.0 | 0.002 |
| 697.0 | 0 |
| 696.0 | 0.005 |
| 695.0 | 0.004 |
| 694.0 | 0.003 |
| 693.0 | 0.003 |
| 692.0 | 0.005 |
| 691.0 | 0.004 |
| 690.0 | 0.002 |
| 689.0 | 0.002 |
| 688.0 | 0.006 |
| 687.0 | 0.008 |
| 686.0 | 0.006 |
| 685.0 | 0 |
| 684.0 | 0.002 |
| 683.0 | 0.005 |
| 682.0 | 0.007 |
| 681.0 | 0.005 |
| 680.0 | 0.004 |
| 679.0 | 0.003 |
| 678.0 | 0.005 |
| 677.0 | 0.002 |
| 676.0 | 0.002 |
| 675.0 | 0.005 |
| 674.0 | 0.005 |
| 673.0 | 0.005 |
| 672.0 | 0.004 |
| 671.0 | 0.005 |
| 670.0 | 0.006 |
| 669.0 | 0.005 |
| 668.0 | 0.004 |
| 667.0 | 0.004 |
| 666.0 | 0.005 |
| 665.0 | 0.006 |
| 664.0 | 0.004 |
| 663.0 | 0.001 |
| 662.0 | 0.004 |
| 661.0 | 0.008 |
| 660.0 | 0.005 |
| 659.0 | 0.004 |
| 658.0 | 0.004 |
| 657.0 | 0.003 |
| 656.0 | 0.005 |
| 655.0 | 0.001 |
| 654.0 | 0 |
| 653.0 | 0.004 |
| 652.0 | 0.005 |
| 651.0 | 0.003 |
| 650.0 | 0.006 |
| 649.0 | 0.008 |
| 648.0 | 0.005 |
| 647.0 | 0.004 |
| 646.0 | 0.006 |
| 645.0 | 0.006 |
| 644.0 | 0.003 |
| 643.0 | 0.002 |
| 642.0 | 0.002 |
| 641.0 | 0.001 |
| 640.0 | 0.004 |
| 639.0 | 0.002 |
| 638.0 | 0.003 |
| 637.0 | 0.003 |
| 636.0 | 0.002 |
| 635.0 | 0.003 |
| 634.0 | 0.003 |
| 633.0 | 0 |
| 632.0 | 0.007 |
| 631.0 | 0.01 |
| 630.0 | 0.006 |
| 629.0 | 0.004 |
| 628.0 | 0.002 |
| 627.0 | 0.002 |
| 626.0 | 0.004 |
| 625.0 | 0.002 |
| 624.0 | 0 |
| 623.0 | 0.003 |
| 622.0 | 0.001 |
| 621.0 | 0.001 |
| 620.0 | 0.003 |
| 619.0 | 0.002 |
| 618.0 | 0.002 |
| 617.0 | 0.003 |
| 616.0 | 0.005 |
| 615.0 | 0.003 |
| 614.0 | 0.003 |
| 613.0 | 0.008 |
| 612.0 | 0.007 |
| 611.0 | 0.004 |
| 610.0 | 0.002 |
| 609.0 | 0.002 |
| 608.0 | 0.001 |
| 607.0 | 0.005 |
| 606.0 | 0.004 |
| 605.0 | 0.003 |
| 604.0 | 0.003 |
| 603.0 | 0.003 |
| 602.0 | 0.006 |
| 601.0 | 0.005 |
| 600.0 | 0.003 |
| 599.0 | 0.006 |
| 598.0 | 0.006 |
| 597.0 | 0.002 |
| 596.0 | 0.004 |
| 595.0 | 0.007 |
| 594.0 | 0.007 |
| 593.0 | 0.005 |
| 592.0 | 0.004 |
| 591.0 | 0.006 |
| 590.0 | 0.008 |
| 589.0 | 0.005 |
| 588.0 | 0.004 |
| 587.0 | 0.008 |
| 586.0 | 0.008 |
| 585.0 | 0.007 |
| 584.0 | 0.007 |
| 583.0 | 0.007 |
| 582.0 | 0.005 |
| 581.0 | 0.005 |
| 580.0 | 0.007 |
| 579.0 | 0.006 |
| 578.0 | 0.005 |
| 577.0 | 0.005 |
| 576.0 | 0.006 |
| 575.0 | 0.006 |
| 574.0 | 0.007 |
| 573.0 | 0.007 |
| 572.0 | 0.006 |
| 571.0 | 0.008 |
| 570.0 | 0.008 |
| 569.0 | 0.007 |
| 568.0 | 0.009 |
| 567.0 | 0.009 |
| 566.0 | 0.009 |
| 565.0 | 0.01 |
| 564.0 | 0.008 |
| 563.0 | 0.008 |
| 562.0 | 0.009 |
| 561.0 | 0.008 |
| 560.0 | 0.009 |
| 559.0 | 0.009 |
| 558.0 | 0.007 |
| 557.0 | 0.01 |
| 556.0 | 0.01 |
| 555.0 | 0.011 |
| 554.0 | 0.014 |
| 553.0 | 0.009 |
| 552.0 | 0.005 |
| 551.0 | 0.005 |
| 550.0 | 0.009 |
| 549.0 | 0.01 |
| 548.0 | 0.005 |
| 547.0 | 0.007 |
| 546.0 | 0.011 |
| 545.0 | 0.019 |
| 544.0 | 0.045 |
| 543.0 | 0.132 |
| 542.0 | 0.354 |
| 541.0 | 0.837 |
| 540.0 | 2.65 |
| 539.0 | 3.567 |
| 538.0 | 4.292 |
| 537.0 | 5.22 |
| 536.0 | 5.983 |
| 535.0 | 6.042 |
| 534.0 | 6.061 |
| 533.0 | 6.039 |
| 532.0 | 6.088 |
| 531.0 | 5.355 |
| 530.0 | 4.304 |
| 529.0 | 3.474 |
| 528.0 | 2.317 |
| 527.0 | 0.825 |
| 526.0 | 0.236 |
| 525.0 | 0.034 |
| 524.0 | 0.017 |
| 523.0 | 0.017 |
| 522.0 | 0.011 |
| 521.0 | 0.008 |
| 520.0 | 0.006 |
| 519.0 | 0.006 |
| 518.0 | 0.007 |
| 517.0 | 0.008 |
| 516.0 | 0.009 |
| 515.0 | 0.013 |
| 514.0 | 0.018 |
| 513.0 | 0.016 |
| 512.0 | 0.016 |
| 511.0 | 0.015 |
| 510.0 | 0.015 |
| 509.0 | 0.014 |
| 508.0 | 0.014 |
| 507.0 | 0.013 |
| 506.0 | 0.013 |
| 505.0 | 0.013 |
| 504.0 | 0.012 |
| 503.0 | 0.011 |
| 502.0 | 0.012 |
| 501.0 | 0.013 |
| 500.0 | 0.012 |
| 499.0 | 0.013 |
| 498.0 | 0.01 |
| 497.0 | 0.009 |
| 496.0 | 0.012 |
| 495.0 | 0.012 |
| 494.0 | 0.011 |
| 493.0 | 0.01 |
| 492.0 | 0.009 |
| 491.0 | 0.009 |
| 490.0 | 0.01 |
| 489.0 | 0.009 |
| 488.0 | 0.009 |
| 487.0 | 0.009 |
| 486.0 | 0.01 |
| 485.0 | 0.009 |
| 484.0 | 0.008 |
| 483.0 | 0.008 |
| 482.0 | 0.008 |
| 481.0 | 0.008 |
| 480.0 | 0.008 |
| 479.0 | 0.009 |
| 478.0 | 0.011 |
| 477.0 | 0.011 |
| 476.0 | 0.009 |
| 475.0 | 0.008 |
| 474.0 | 0.01 |
| 473.0 | 0.01 |
| 472.0 | 0.009 |
| 471.0 | 0.008 |
| 470.0 | 0.009 |
| 469.0 | 0.012 |
| 468.0 | 0.014 |
| 467.0 | 0.013 |
| 466.0 | 0.011 |
| 465.0 | 0.009 |
| 464.0 | 0.011 |
| 463.0 | 0.013 |
| 462.0 | 0.012 |
| 461.0 | 0.014 |
| 460.0 | 0.014 |
| 459.0 | 0.012 |
| 458.0 | 0.01 |
| 457.0 | 0.012 |
| 456.0 | 0.013 |
| 455.0 | 0.013 |
| 454.0 | 0.014 |
| 453.0 | 0.013 |
| 452.0 | 0.011 |
| 451.0 | 0.012 |
| 450.0 | 0.011 |
| 449.0 | 0.013 |
| 448.0 | 0.016 |
| 447.0 | 0.016 |
| 446.0 | 0.015 |
| 445.0 | 0.015 |
| 444.0 | 0.014 |
| 443.0 | 0.012 |
| 442.0 | 0.015 |
| 441.0 | 0.014 |
| 440.0 | 0.013 |
| 439.0 | 0.012 |
| 438.0 | 0.015 |
| 437.0 | 0.015 |
| 436.0 | 0.017 |
| 435.0 | 0.018 |
| 434.0 | 0.019 |
| 433.0 | 0.018 |
| 432.0 | 0.013 |
| 431.0 | 0.015 |
| 430.0 | 0.02 |
| 429.0 | 0.019 |
| 428.0 | 0.018 |
| 427.0 | 0.017 |
| 426.0 | 0.017 |
| 425.0 | 0.019 |
| 424.0 | 0.02 |
| 423.0 | 0.019 |
| 422.0 | 0.019 |
| 421.0 | 0.016 |
| 420.0 | 0.017 |
| 419.0 | 0.018 |
| 418.0 | 0.018 |
| 417.0 | 0.018 |
| 416.0 | 0.018 |
| 415.0 | 0.023 |
| 414.0 | 0.024 |
| 413.0 | 0.024 |
| 412.0 | 0.024 |
| 411.0 | 0.028 |
| 410.0 | 0.027 |
| 409.0 | 0.028 |
| 408.0 | 0.032 |
| 407.0 | 0.032 |
| 406.0 | 0.033 |
| 405.0 | 0.033 |
| 404.0 | 0.032 |
| 403.0 | 0.038 |
| 402.0 | 0.043 |
| 401.0 | 0.044 |
| 400.0 | 0.043 |
| 399.0 | 0.061 |
| 398.0 | 0.063 |
| 397.0 | 0.067 |
| 396.0 | 0.072 |
| 395.0 | 0.08 |
| 394.0 | 0.09 |
| 393.0 | 0.102 |
| 392.0 | 0.112 |
| 391.0 | 0.119 |
| 390.0 | 0.126 |
| 389.0 | 0.14 |
| 388.0 | 0.188 |
| 387.0 | 0.306 |
| 386.0 | 0.514 |
| 385.0 | 0.812 |
| 384.0 | 1.196 |
| 383.0 | 1.684 |
| 382.0 | 2.326 |
| 381.0 | 3.21 |
| 380.0 | 4.451 |
| 379.0 | 5.164 |
| 378.0 | 4.448 |
| 377.0 | 4.408 |
| 376.0 | 4.559 |
| 375.0 | 4.793 |
| 374.0 | 4.577 |
| 373.0 | 4.939 |
| 372.0 | 5.24 |
| 371.0 | 4.407 |
| 370.0 | 4.336 |
| 369.0 | 4.637 |
| 368.0 | 4.576 |
| 367.0 | 4.859 |
| 366.0 | 5.636 |
| 365.0 | 4.432 |
| 364.0 | 4.346 |
| 363.0 | 4.636 |
| 362.0 | 4.489 |
| 361.0 | 4.706 |
| 360.0 | 4.895 |
| 359.0 | 4.334 |
| 358.0 | 4.237 |
| 357.0 | 4.219 |
| 356.0 | 4.302 |
| 355.0 | 4.417 |
| 354.0 | 4.856 |
| 353.0 | 4.301 |
| 352.0 | 4.236 |
| 351.0 | 4.704 |
| 350.0 | 4.343 |
| 349.0 | 4.893 |
| 348.0 | 5.031 |
| 347.0 | 4.321 |
| 346.0 | 4.28 |
| 345.0 | 4.27 |
| 344.0 | 4.299 |
| 343.0 | 4.786 |
| 342.0 | 4.891 |
| 341.0 | 4.388 |
| 340.0 | 4.139 |
| 339.0 | 4.329 |
| 338.0 | 4.363 |
| 337.0 | 4.852 |
| 336.0 | 4.89 |
| 335.0 | 4.329 |
| 334.0 | 4.198 |
| 333.0 | 4.784 |
| 332.0 | 4.277 |
| 331.0 | 4.608 |
| 330.0 | 4.675 |
| 329.0 | 4.424 |
| 328.0 | 4.213 |
| 327.0 | 4.385 |
| 326.0 | 4.306 |
| 325.0 | 4.815 |
| 324.0 | 4.753 |
| 323.0 | 4.41 |
| 322.0 | 4.157 |
| 321.0 | 4.886 |
| 320.0 | 4.238 |
| 319.0 | 4.928 |
| 318.0 | 4.494 |
| 317.0 | 4.253 |
| 316.0 | 4.322 |
| 315.0 | 4.526 |
| 314.0 | 4.433 |
| 313.0 | 4.623 |
| 312.0 | 5.321 |
| 311.0 | 4.392 |
| 310.0 | 4.233 |
| 309.0 | 4.718 |
| 308.0 | 4.366 |
| 307.0 | 4.56 |
| 306.0 | 5.921 |
| 305.0 | 4.298 |
| 304.0 | 4.341 |
| 303.0 | 4.559 |
| 302.0 | 4.364 |
| 301.0 | 4.879 |
| 300.0 | 5.318 |
| 299.0 | 4.364 |
| 298.0 | 4.328 |
| 297.0 | 4.577 |
| 296.0 | 4.363 |
| 295.0 | 4.965 |
| 294.0 | 5.22 |
| 293.0 | 4.35 |
| 292.0 | 4.228 |
| 291.0 | 4.741 |
| 290.0 | 4.245 |
| 289.0 | 5.072 |
| 288.0 | 5.139 |
| 287.0 | 4.304 |
| 286.0 | 4.192 |
| 285.0 | 4.536 |
| 284.0 | 4.253 |
| 283.0 | 5.439 |
| 282.0 | 4.769 |
| 281.0 | 4.383 |
| 280.0 | 4.151 |
| 279.0 | 5.914 |
| 278.0 | 4.233 |
| 277.0 | 5.613 |
| 276.0 | 4.872 |
| 275.0 | 4.451 |
| 274.0 | 4.189 |
| 273.0 | 4.871 |
| 272.0 | 4.135 |
| 271.0 | 5.435 |
| 270.0 | 4.394 |
| 269.0 | 4.3 |
| 268.0 | 4.196 |
| 267.0 | 4.497 |
| 266.0 | 4.497 |
| 265.0 | 4.958 |
| 264.0 | 4.708 |
| 263.0 | 4.299 |
| 262.0 | 4.239 |
| 261.0 | 4.496 |
| 260.0 | 4.187 |
| 259.0 | 5.434 |
| 258.0 | 4.869 |
| 257.0 | 4.203 |
| 256.0 | 4.154 |
| 255.0 | 4.228 |
| 254.0 | 4.296 |
| 253.0 | 5.063 |
| 252.0 | 4.794 |
| 251.0 | 4.2 |
| 250.0 | 4.108 |
| 249.0 | 4.606 |
| 248.0 | 4.235 |
| 247.0 | 5.128 |
| 246.0 | 5.606 |
| 245.0 | 4.198 |
| 244.0 | 4.207 |
| 243.0 | 4.458 |
| 242.0 | 4.282 |
| 241.0 | 4.827 |
| 240.0 | 4.73 |
| 239.0 | 4.198 |
| 238.0 | 4.157 |
| 237.0 | 4.4 |
| 236.0 | 4.491 |
| 235.0 | 4.792 |
| 234.0 | 4.826 |
| 233.0 | 4.149 |
| 232.0 | 4.233 |
| 231.0 | 4.399 |
| 230.0 | 4.271 |
| 229.0 | 4.7 |
| 228.0 | 4.648 |
| 227.0 | 4.146 |
| 226.0 | 4.299 |
| 225.0 | 4.396 |
| 224.0 | 4.344 |
| 223.0 | 4.538 |
| 222.0 | 4.694 |
| 221.0 | 4.207 |
| 220.0 | 4.198 |
| 219.0 | 4.364 |
| 218.0 | 4.363 |
| 217.0 | 4.639 |
| 216.0 | 4.638 |
| 215.0 | 4.073 |
| 214.0 | 4.193 |
| 213.0 | 4.289 |
| 212.0 | 4.218 |
| 211.0 | 4.61 |
| 210.0 | 4.426 |
| 209.0 | 4.18 |
| 208.0 | 4.116 |
| 207.0 | 4.423 |
| 206.0 | 4.195 |
| 205.0 | 4.469 |
| 204.0 | 4.293 |
| 203.0 | 4.002 |
| 202.0 | 4.001 |
| 201.0 | 4.209 |
| 200.0 | 3.972 |